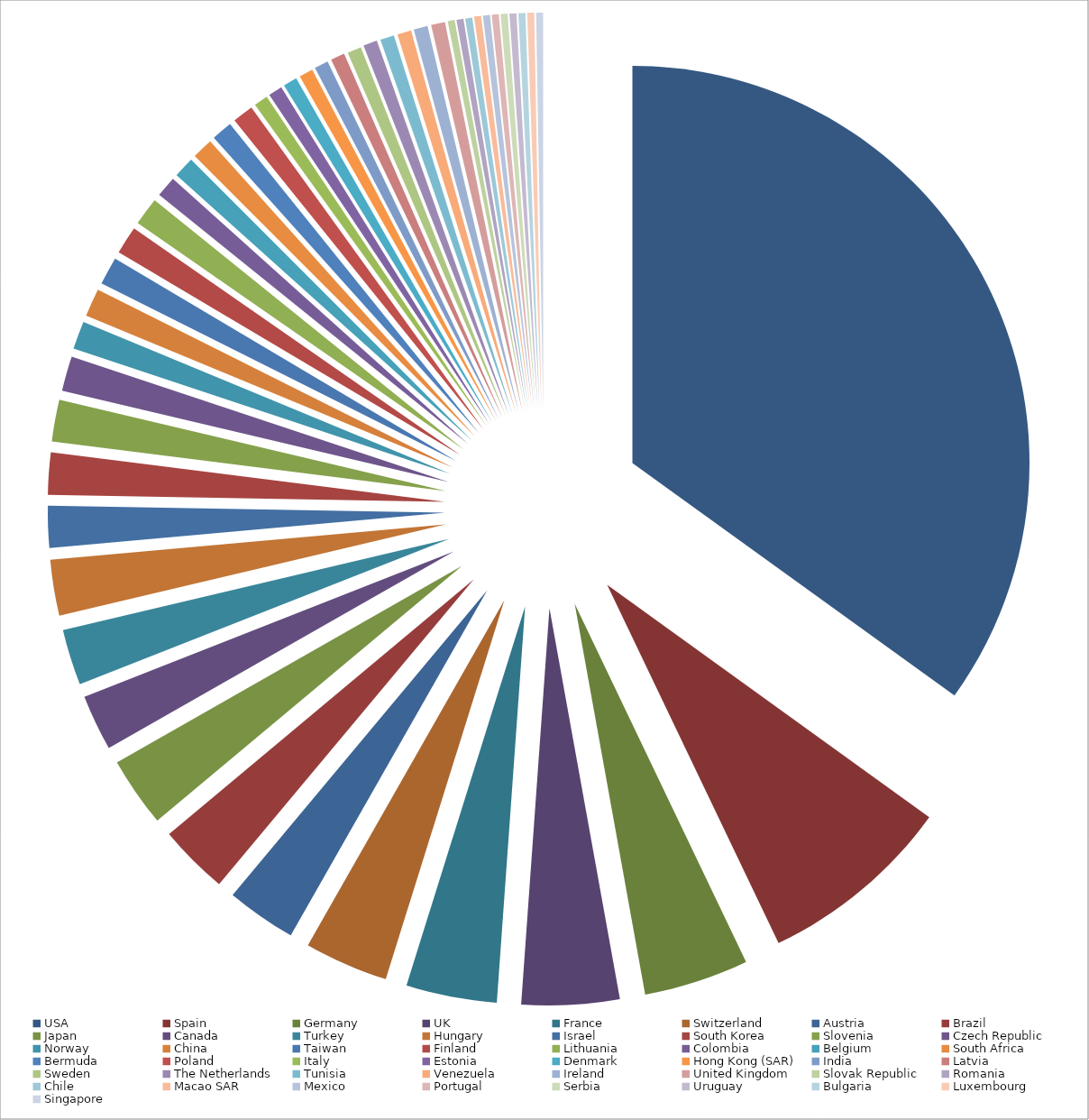
| Category | # of Root Certificates |
|---|---|
| USA | 123 |
| Spain | 28 |
| Germany | 15 |
| UK | 14 |
| France | 13 |
| Switzerland | 12 |
| Austria | 10 |
| Brazil | 10 |
| Japan | 10 |
| Canada | 8 |
| Turkey | 8 |
| Hungary | 8 |
| Israel | 6 |
| South Korea | 6 |
| Slovenia | 6 |
| Czech Republic | 5 |
| Norway | 4 |
| China | 4 |
| Taiwan | 4 |
| Finland | 4 |
| Lithuania | 4 |
| Colombia | 3 |
| Belgium | 3 |
| South Africa | 3 |
| Bermuda | 3 |
| Poland | 3 |
| Italy | 2 |
| Estonia | 2 |
| Denmark | 2 |
| Hong Kong (SAR) | 2 |
| India | 2 |
| Latvia | 2 |
| Sweden | 2 |
| The Netherlands | 2 |
| Tunisia | 2 |
| Venezuela | 2 |
| Ireland | 2 |
| United Kingdom | 2 |
| Slovak Republic | 1 |
| Romania | 1 |
| Chile | 1 |
| Macao SAR | 1 |
| Mexico | 1 |
| Portugal | 1 |
| Serbia | 1 |
| Uruguay | 1 |
| Bulgaria | 1 |
| Luxembourg | 1 |
| Singapore | 1 |